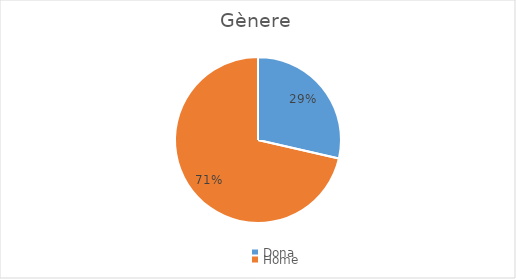
| Category | Series 0 |
|---|---|
| Dona | 2 |
| Home | 5 |